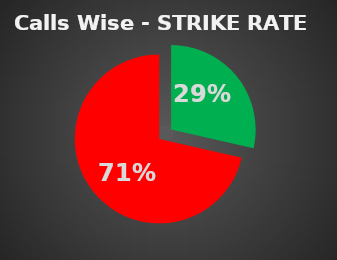
| Category | Series 0 |
|---|---|
| 0 | 0.286 |
| 1 | 0.714 |